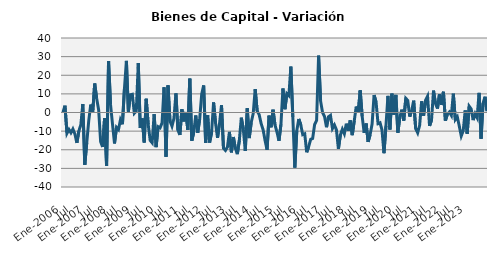
| Category | Series 0 |
|---|---|
| Ene-2006 | 0.156 |
|  | 3.665 |
|  | -11.15 |
|  | -9.092 |
|  | -10.879 |
|  | -8.853 |
| Jul | -11.504 |
|  | -16.326 |
|  | -9.97 |
|  | -6.611 |
|  | 4.565 |
|  | -28.073 |
| Ene-2007 | -16.228 |
|  | -4.364 |
|  | 4.244 |
|  | 0.054 |
|  | 15.542 |
|  | 7.486 |
| Jul | 1.348 |
|  | -15.707 |
|  | -18.502 |
|  | -2.976 |
|  | -28.733 |
|  | 27.66 |
| Ene-2008 | 4.22 |
|  | -6.401 |
|  | -16.625 |
|  | -7.99 |
|  | -9.14 |
|  | -3.908 |
| Jul | -6.307 |
|  | 12.568 |
|  | 27.728 |
|  | 0.398 |
|  | 9.511 |
|  | 9.777 |
| Ene-2009 | -0.418 |
|  | 0.771 |
|  | 26.557 |
|  | -8.277 |
|  | -3.166 |
|  | -16.091 |
| Jul | 7.363 |
|  | -6.294 |
|  | -14.984 |
|  | -16.271 |
|  | -0.895 |
|  | -18.58 |
| Ene-2010 | -7.59 |
|  | -8.207 |
|  | -5.589 |
|  | 13.516 |
|  | -23.739 |
|  | 14.582 |
| Jul | -4.636 |
|  | -7.339 |
|  | -3.122 |
|  | 10.248 |
|  | -9.516 |
|  | -12.009 |
| Ene-2011 | 1.723 |
|  | -4.774 |
|  | 0.277 |
|  | -9.37 |
|  | 18.185 |
|  | -15.188 |
| Jul | -10.651 |
|  | -1.601 |
|  | -10.89 |
|  | -3.474 |
|  | 9.799 |
|  | 14.524 |
| Ene-2012 | -16.289 |
|  | -1.421 |
|  | -16.142 |
|  | -10.766 |
|  | 5.39 |
|  | -5.737 |
| Jul | -13.636 |
|  | -5.94 |
|  | 3.897 |
|  | -19.173 |
|  | -20.348 |
|  | -18.517 |
| Ene-2013 | -10.409 |
|  | -21.405 |
|  | -13.168 |
|  | -19.267 |
|  | -22.359 |
|  | -14.955 |
| Jul | -2.781 |
|  | -8.818 |
|  | -20.65 |
|  | 2.295 |
|  | -13.708 |
|  | -5.321 |
| Ene-2014 | -0.598 |
|  | 12.524 |
|  | 0.778 |
|  | -1.106 |
|  | -5.941 |
|  | -9.249 |
| Jul | -15.127 |
|  | -20.026 |
|  | -1.687 |
|  | -7.931 |
|  | 1.494 |
|  | -6.691 |
| Ene-2015 | -10.526 |
|  | -15.2 |
|  | -6.399 |
|  | 12.89 |
|  | 1.773 |
|  | 10.117 |
| Jul | 9.049 |
|  | 24.657 |
|  | -2.413 |
|  | -29.607 |
|  | -9.694 |
|  | -3.473 |
| Ene-2016 | -6.526 |
|  | -11.898 |
|  | -11.434 |
|  | -21.369 |
|  | -18.275 |
|  | -14.365 |
| Jul | -13.935 |
|  | -6.446 |
|  | -4.255 |
|  | 30.53 |
|  | 6.225 |
|  | 0.028 |
| Ene-2017 | -2.135 |
|  | -7.88 |
|  | -2.296 |
|  | -1.537 |
|  | -8.579 |
|  | -6.698 |
| Jul | -9.304 |
|  | -19.538 |
|  | -12.003 |
|  | -8.965 |
|  | -11.433 |
|  | -6.006 |
| Ene-2018 | -9.78 |
|  | -4.231 |
|  | -12.165 |
|  | -4.413 |
|  | 3.186 |
|  | -0.138 |
| Jul | 11.904 |
|  | -2.045 |
|  | -10.953 |
|  | -5.906 |
|  | -15.786 |
|  | -11.95 |
| Ene-2019 | -6.206 |
|  | 9.373 |
|  | 5.736 |
|  | -5.979 |
|  | -5.497 |
|  | -9.392 |
| Jul | -21.856 |
|  | -7.192 |
|  | 8.926 |
|  | -9.111 |
|  | 10.116 |
|  | -1.124 |
| Ene-2020 | 9.441 |
|  | -10.87 |
|  | -2.504 |
|  | 1.518 |
|  | -4.352 |
|  | 7.612 |
| Jul | 6.469 |
|  | -2.224 |
|  | 1.096 |
|  | 6.367 |
|  | -8.747 |
|  | -10.912 |
| Ene-2021 | -6.906 |
|  | 6.013 |
|  | -1.678 |
|  | 6.665 |
|  | 8.769 |
|  | -7.208 |
| Jul | -4.019 |
|  | 11.743 |
|  | 4.805 |
|  | 2.11 |
|  | 9.762 |
|  | 4.104 |
| Ene-2022 | 11.146 |
|  | -4.403 |
|  | -0.92 |
|  | 0.243 |
|  | -1.556 |
|  | 10.113 |
| Jul | -3.788 |
|  | -2.321 |
|  | -7.232 |
|  | -12.625 |
|  | -9.777 |
|  | 1.117 |
| Ene-2023 | -11.441 |